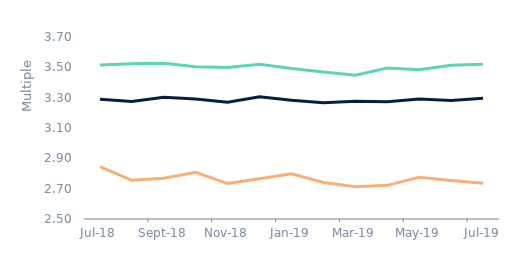
| Category | First-time
buyers | Homemovers | Remortgagors |
|---|---|---|---|
| 2018-07-01 | 3.515 | 3.29 | 2.845 |
| 2018-08-01 | 3.524 | 3.275 | 2.755 |
| 2018-09-01 | 3.528 | 3.302 | 2.769 |
| 2018-10-01 | 3.504 | 3.292 | 2.808 |
| 2018-11-01 | 3.499 | 3.27 | 2.734 |
| 2018-12-01 | 3.521 | 3.306 | 2.766 |
| 2019-01-01 | 3.493 | 3.283 | 2.798 |
| 2019-02-01 | 3.47 | 3.267 | 2.74 |
| 2019-03-01 | 3.447 | 3.276 | 2.713 |
| 2019-04-01 | 3.495 | 3.274 | 2.722 |
| 2019-05-01 | 3.483 | 3.291 | 2.775 |
| 2019-06-01 | 3.514 | 3.281 | 2.754 |
| 2019-07-01 | 3.52 | 3.296 | 2.735 |